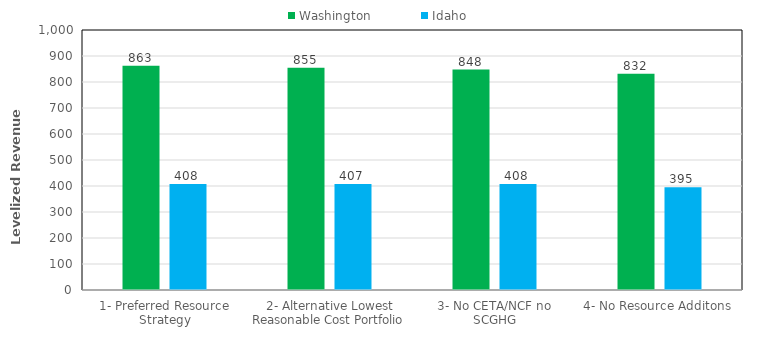
| Category | Washington | Idaho |
|---|---|---|
| 1- Preferred Resource Strategy | 862.542 | 408.004 |
| 2- Alternative Lowest Reasonable Cost Portfolio | 854.713 | 407.434 |
| 3- No CETA/NCF no SCGHG | 847.619 | 407.682 |
| 4- No Resource Additons | 831.64 | 395.418 |